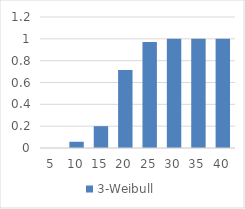
| Category | 3-Weibull |
|---|---|
| 5.0 | 0 |
| 10.0 | 0.057 |
| 15.0 | 0.2 |
| 20.0 | 0.714 |
| 25.0 | 0.971 |
| 30.0 | 1 |
| 35.0 | 1 |
| 40.0 | 1 |